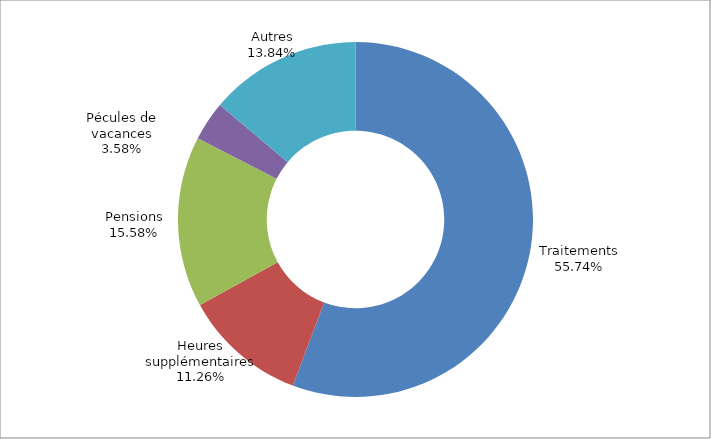
| Category | Series 0 |
|---|---|
| Traitements | 0.557 |
| Heures supplémentaires | 0.113 |
| Pensions | 0.156 |
| Pécules de vacances | 0.036 |
| Autres | 0.138 |